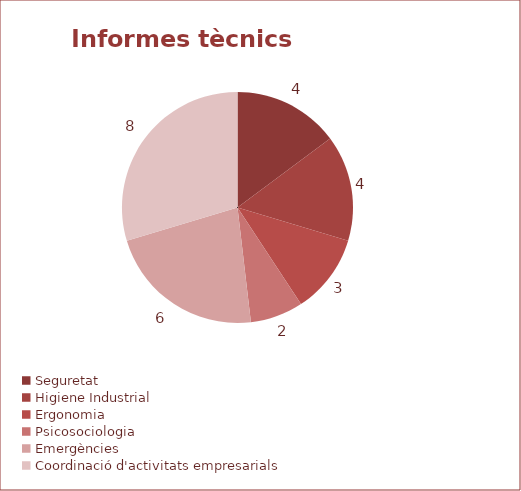
| Category | Series 0 |
|---|---|
| Seguretat | 4 |
| Higiene Industrial | 4 |
| Ergonomia | 3 |
| Psicosociologia | 2 |
| Emergències | 6 |
| Coordinació d'activitats empresarials | 8 |